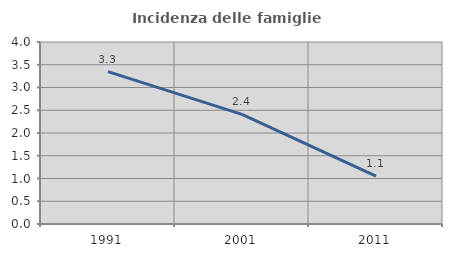
| Category | Incidenza delle famiglie numerose |
|---|---|
| 1991.0 | 3.348 |
| 2001.0 | 2.41 |
| 2011.0 | 1.054 |